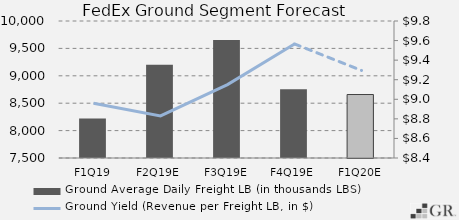
| Category | Ground Average Daily Freight LB (in thousands LBS) |
|---|---|
|  F1Q19  | 8221 |
|  F2Q19E  | 9200.458 |
|  F3Q19E  | 9651.033 |
|  F4Q19E  | 8755.837 |
|  F1Q20E  | 8658.255 |